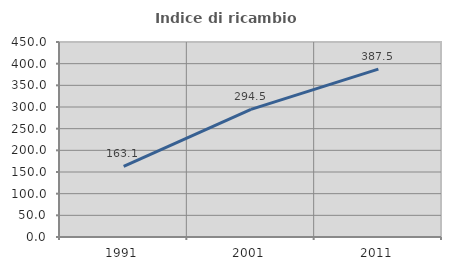
| Category | Indice di ricambio occupazionale  |
|---|---|
| 1991.0 | 163.139 |
| 2001.0 | 294.5 |
| 2011.0 | 387.5 |